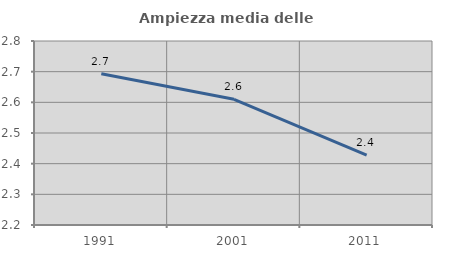
| Category | Ampiezza media delle famiglie |
|---|---|
| 1991.0 | 2.693 |
| 2001.0 | 2.61 |
| 2011.0 | 2.428 |